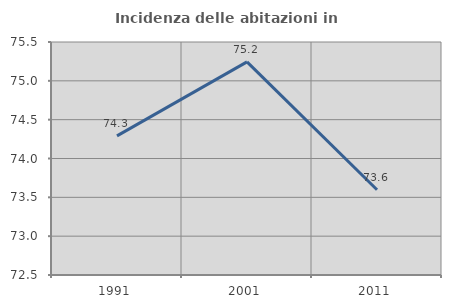
| Category | Incidenza delle abitazioni in proprietà  |
|---|---|
| 1991.0 | 74.291 |
| 2001.0 | 75.245 |
| 2011.0 | 73.597 |